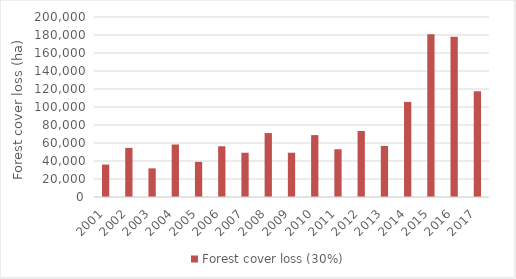
| Category | Forest cover loss (30%) |
|---|---|
| 2001.0 | 36005.135 |
| 2002.0 | 54575.502 |
| 2003.0 | 31805.614 |
| 2004.0 | 58329.433 |
| 2005.0 | 39021.216 |
| 2006.0 | 56388.405 |
| 2007.0 | 49173.003 |
| 2008.0 | 71045.211 |
| 2009.0 | 49210.439 |
| 2010.0 | 68761.271 |
| 2011.0 | 53046.612 |
| 2012.0 | 73341.655 |
| 2013.0 | 56667.807 |
| 2014.0 | 105664.415 |
| 2015.0 | 180806.567 |
| 2016.0 | 177925.927 |
| 2017.0 | 117509.484 |